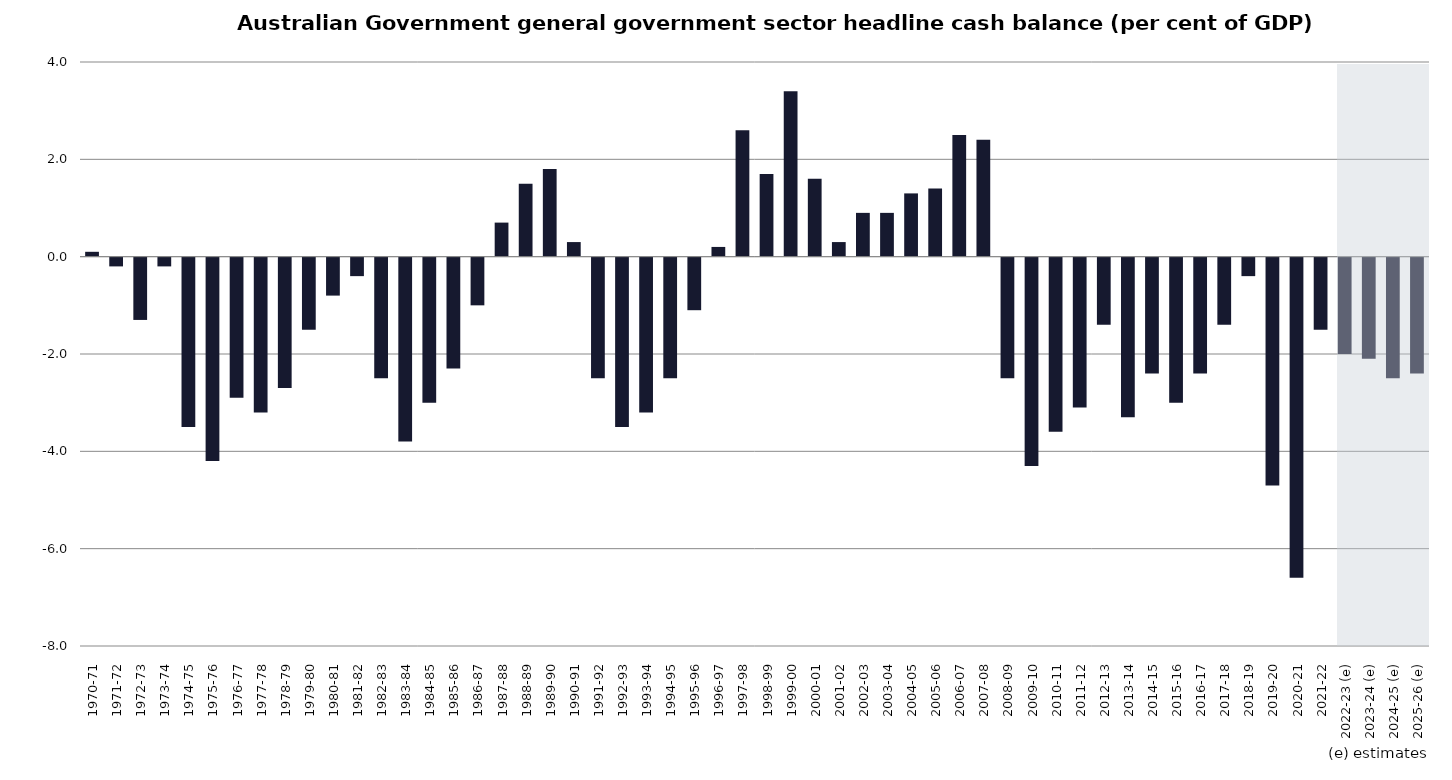
| Category | Series 0 |
|---|---|
| 1970-71 | 0.1 |
| 1971-72 | -0.2 |
| 1972-73 | -1.3 |
| 1973-74 | -0.2 |
| 1974-75 | -3.5 |
| 1975-76 | -4.2 |
| 1976-77 | -2.9 |
| 1977-78 | -3.2 |
| 1978-79 | -2.7 |
| 1979-80 | -1.5 |
| 1980-81 | -0.8 |
| 1981-82 | -0.4 |
| 1982-83 | -2.5 |
| 1983-84 | -3.8 |
| 1984-85 | -3 |
| 1985-86 | -2.3 |
| 1986-87 | -1 |
| 1987-88 | 0.7 |
| 1988-89 | 1.5 |
| 1989-90 | 1.8 |
| 1990-91 | 0.3 |
| 1991-92 | -2.5 |
| 1992-93 | -3.5 |
| 1993-94 | -3.2 |
| 1994-95 | -2.5 |
| 1995-96 | -1.1 |
| 1996-97 | 0.2 |
| 1997-98 | 2.6 |
| 1998-99 | 1.7 |
| 1999-00 | 3.4 |
| 2000-01 | 1.6 |
| 2001-02 | 0.3 |
| 2002-03 | 0.9 |
| 2003-04 | 0.9 |
| 2004-05 | 1.3 |
| 2005-06 | 1.4 |
| 2006-07 | 2.5 |
| 2007-08 | 2.4 |
| 2008-09 | -2.5 |
| 2009-10 | -4.3 |
| 2010-11 | -3.6 |
| 2011-12 | -3.1 |
| 2012-13 | -1.4 |
| 2013-14 | -3.3 |
| 2014-15 | -2.4 |
| 2015-16 | -3 |
| 2016-17 | -2.4 |
| 2017-18 | -1.4 |
| 2018-19 | -0.4 |
| 2019-20 | -4.7 |
| 2020-21 | -6.6 |
| 2021-22 | -1.5 |
| 2022-23 (e) | -2 |
| 2023-24 (e) | -2.1 |
| 2024-25 (e) | -2.5 |
| 2025-26 (e) | -2.4 |